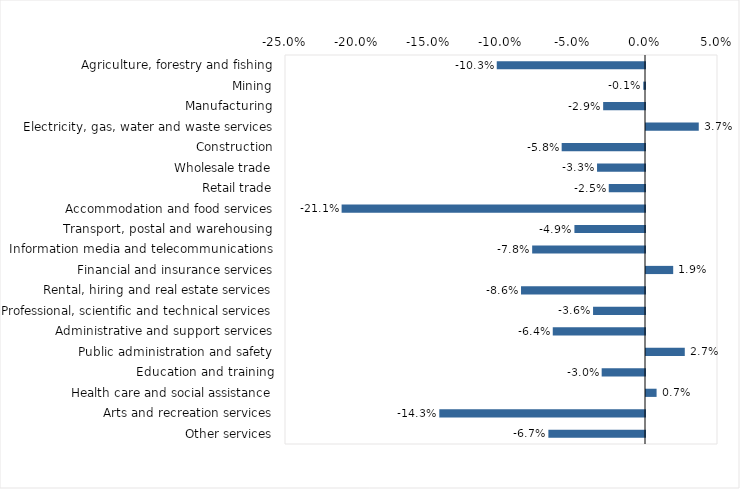
| Category | This week |
|---|---|
| Agriculture, forestry and fishing | -0.103 |
| Mining | -0.001 |
| Manufacturing | -0.029 |
| Electricity, gas, water and waste services | 0.037 |
| Construction | -0.058 |
| Wholesale trade | -0.033 |
| Retail trade | -0.025 |
| Accommodation and food services | -0.211 |
| Transport, postal and warehousing | -0.049 |
| Information media and telecommunications | -0.078 |
| Financial and insurance services | 0.019 |
| Rental, hiring and real estate services | -0.086 |
| Professional, scientific and technical services | -0.036 |
| Administrative and support services | -0.064 |
| Public administration and safety | 0.027 |
| Education and training | -0.03 |
| Health care and social assistance | 0.007 |
| Arts and recreation services | -0.143 |
| Other services | -0.067 |